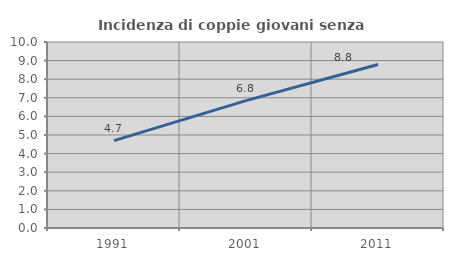
| Category | Incidenza di coppie giovani senza figli |
|---|---|
| 1991.0 | 4.695 |
| 2001.0 | 6.849 |
| 2011.0 | 8.787 |